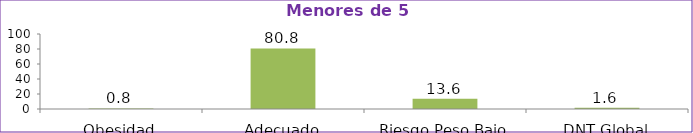
| Category | Series 0 |
|---|---|
| Obesidad | 0.8 |
| Adecuado | 80.8 |
| Riesgo Peso Bajo | 13.6 |
| DNT Global | 1.6 |